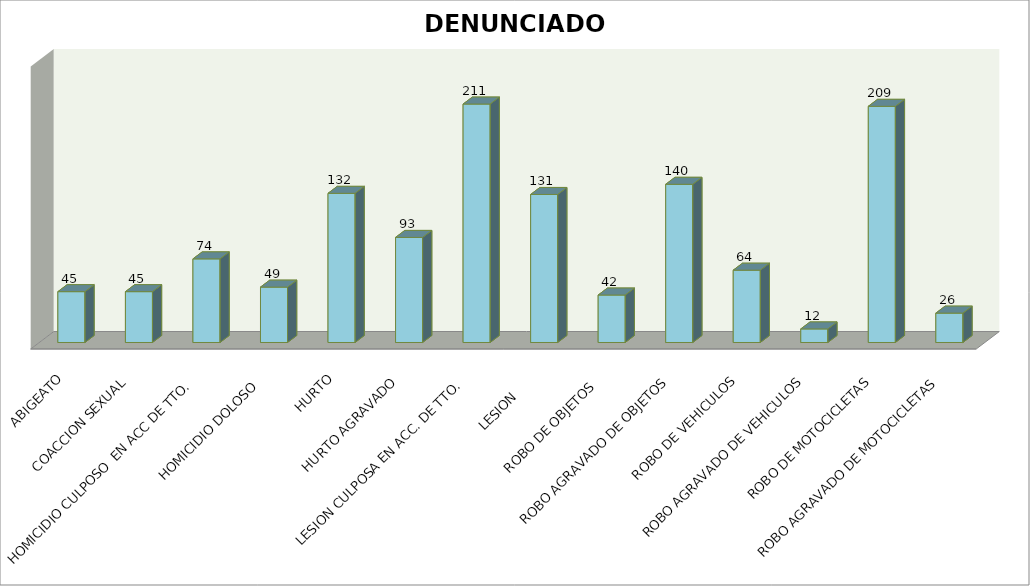
| Category | DENUNCIADOS |
|---|---|
| ABIGEATO | 45 |
| COACCION SEXUAL | 45 |
| HOMICIDIO CULPOSO  EN ACC DE TTO.  | 74 |
| HOMICIDIO DOLOSO  | 49 |
| HURTO | 132 |
| HURTO AGRAVADO | 93 |
| LESION CULPOSA EN ACC. DE TTO. | 211 |
| LESION      | 131 |
| ROBO DE OBJETOS  | 42 |
| ROBO AGRAVADO DE OBJETOS | 140 |
| ROBO DE VEHICULOS | 64 |
| ROBO AGRAVADO DE VEHICULOS | 12 |
| ROBO DE MOTOCICLETAS | 209 |
| ROBO AGRAVADO DE MOTOCICLETAS | 26 |